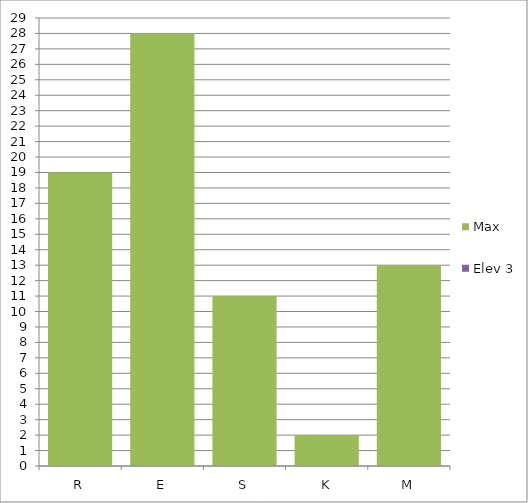
| Category | Max | Elev 3 |
|---|---|---|
| R | 19 | 0 |
| E | 28 | 0 |
| S | 11 | 0 |
| K | 2 | 0 |
| M | 13 | 0 |